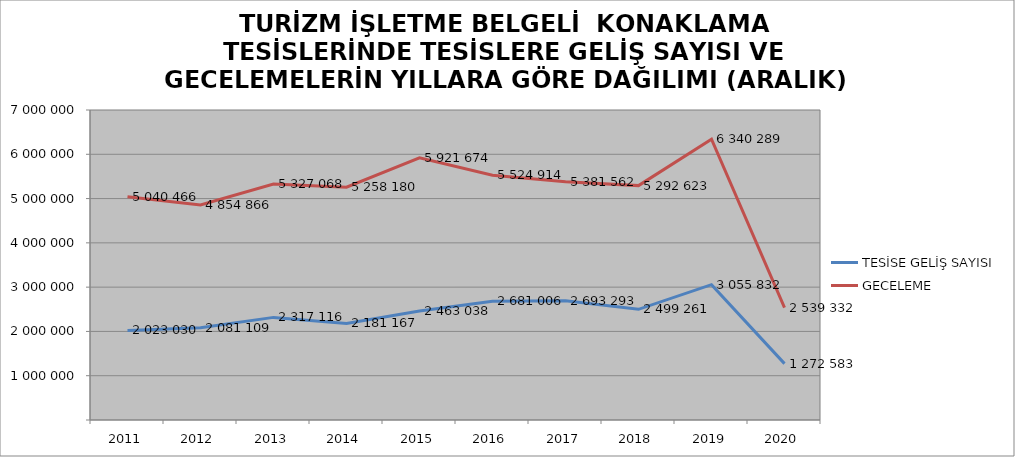
| Category | TESİSE GELİŞ SAYISI | GECELEME |
|---|---|---|
| 2011 | 2023030 | 5040466 |
| 2012 | 2081109 | 4854866 |
| 2013 | 2317116 | 5327068 |
| 2014 | 2181167 | 5258180 |
| 2015 | 2463038 | 5921674 |
| 2016 | 2681006 | 5524914 |
| 2017 | 2693293 | 5381562 |
| 2018 | 2499261 | 5292623 |
| 2019 | 3055832 | 6340289 |
| 2020 | 1272583 | 2539332 |